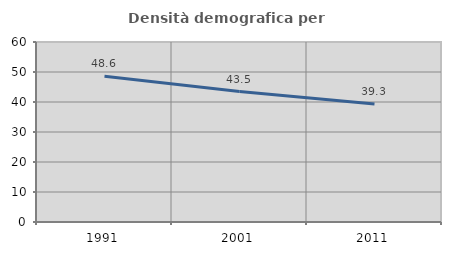
| Category | Densità demografica |
|---|---|
| 1991.0 | 48.6 |
| 2001.0 | 43.469 |
| 2011.0 | 39.335 |